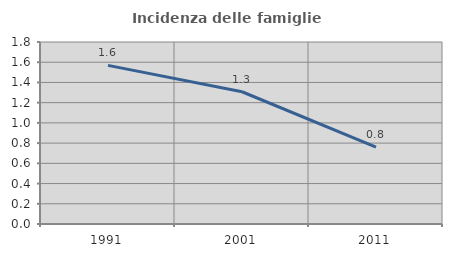
| Category | Incidenza delle famiglie numerose |
|---|---|
| 1991.0 | 1.569 |
| 2001.0 | 1.308 |
| 2011.0 | 0.761 |